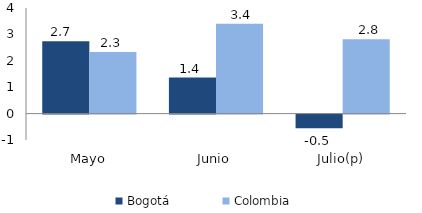
| Category | Bogotá | Colombia |
|---|---|---|
| Mayo | 2.745 | 2.333 |
| Junio | 1.366 | 3.407 |
| Julio(p) | -0.516 | 2.813 |